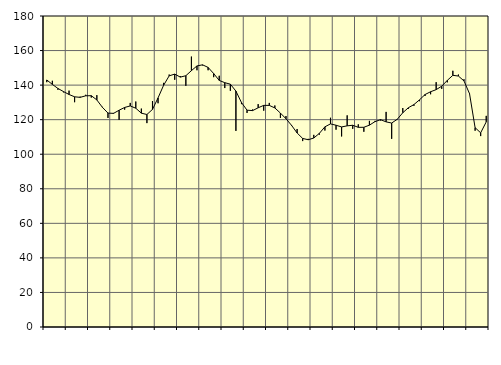
| Category | Piggar | Series 1 |
|---|---|---|
| nan | 141.7 | 142.97 |
| 1.0 | 142.5 | 140.41 |
| 1.0 | 137.3 | 138.07 |
| 1.0 | 135.8 | 136.26 |
| nan | 136.8 | 134.57 |
| 2.0 | 130.1 | 133.23 |
| 2.0 | 133.3 | 132.92 |
| 2.0 | 134.4 | 133.81 |
| nan | 132.8 | 133.88 |
| 3.0 | 134.2 | 131.41 |
| 3.0 | 127.4 | 127.14 |
| 3.0 | 121 | 123.82 |
| nan | 123.9 | 123.64 |
| 4.0 | 119.9 | 125.46 |
| 4.0 | 125.8 | 127.07 |
| 4.0 | 129.7 | 127.94 |
| nan | 130.5 | 126.62 |
| 5.0 | 126.4 | 123.76 |
| 5.0 | 118 | 122.99 |
| 5.0 | 130.8 | 125.94 |
| nan | 129.5 | 132.59 |
| 6.0 | 141.3 | 139.9 |
| 6.0 | 146.1 | 145.36 |
| 6.0 | 143.1 | 146.37 |
| nan | 145.2 | 144.63 |
| 7.0 | 139.6 | 145.44 |
| 7.0 | 156.5 | 148.37 |
| 7.0 | 148.6 | 151.1 |
| nan | 151.4 | 151.74 |
| 8.0 | 148.6 | 150.24 |
| 8.0 | 144.6 | 146.7 |
| 8.0 | 145.4 | 142.71 |
| nan | 138.3 | 141.41 |
| 9.0 | 136.7 | 140.54 |
| 9.0 | 113.5 | 136.53 |
| 9.0 | 129 | 129.9 |
| nan | 123.9 | 125.49 |
| 10.0 | 125.9 | 125.25 |
| 10.0 | 129 | 126.87 |
| 10.0 | 125.2 | 128.28 |
| nan | 129.7 | 128.26 |
| 11.0 | 128.2 | 126.78 |
| 11.0 | 121 | 123.82 |
| 11.0 | 122.1 | 120.54 |
| nan | 116.4 | 116.73 |
| 12.0 | 114.6 | 112.3 |
| 12.0 | 107.6 | 109.13 |
| 12.0 | 108.9 | 108.38 |
| nan | 111.2 | 109.38 |
| 13.0 | 111.3 | 112.07 |
| 13.0 | 113.7 | 115.86 |
| 13.0 | 121.1 | 117.55 |
| nan | 114.2 | 116.78 |
| 14.0 | 110.3 | 115.79 |
| 14.0 | 122.5 | 116.43 |
| 14.0 | 114.7 | 116.76 |
| nan | 117.3 | 115.56 |
| 15.0 | 113 | 115.59 |
| 15.0 | 119.3 | 116.83 |
| 15.0 | 119.3 | 118.85 |
| nan | 119.5 | 120 |
| 16.0 | 124.5 | 118.73 |
| 16.0 | 108.9 | 118.05 |
| 16.0 | 120 | 120.21 |
| nan | 126.7 | 124.01 |
| 17.0 | 126.3 | 126.9 |
| 17.0 | 128 | 128.74 |
| 17.0 | 130.7 | 131.46 |
| nan | 133.7 | 134.54 |
| 18.0 | 134.7 | 136.16 |
| 18.0 | 141.7 | 137.38 |
| 18.0 | 137.8 | 139.37 |
| nan | 141.6 | 142.74 |
| 19.0 | 148.3 | 145.67 |
| 19.0 | 146.1 | 145.24 |
| 19.0 | 143.4 | 142.43 |
| nan | 135.3 | 135.02 |
| 20.0 | 113.6 | 115.37 |
| 20.0 | 110.5 | 112.38 |
| 20.0 | 122.2 | 118.7 |